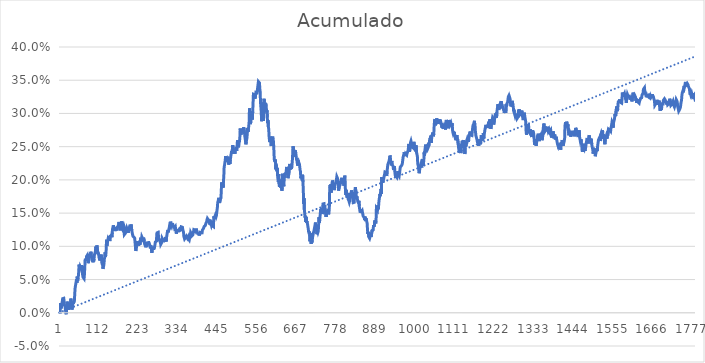
| Category | Acumulado |
|---|---|
| 0 | -0.001 |
| 1 | 0.015 |
| 2 | 0.009 |
| 3 | 0.006 |
| 4 | 0.012 |
| 5 | 0.011 |
| 6 | 0.017 |
| 7 | 0.021 |
| 8 | 0.021 |
| 9 | 0.022 |
| 10 | 0.022 |
| 11 | 0.017 |
| 12 | 0.011 |
| 13 | 0.011 |
| 14 | 0.009 |
| 15 | 0.003 |
| 16 | 0.002 |
| 17 | -0.002 |
| 18 | 0.007 |
| 19 | 0.012 |
| 20 | 0.017 |
| 21 | 0.008 |
| 22 | 0.005 |
| 23 | 0.008 |
| 24 | 0.005 |
| 25 | 0.005 |
| 26 | 0.011 |
| 27 | 0.011 |
| 28 | 0.011 |
| 29 | 0.013 |
| 30 | 0.021 |
| 31 | 0.014 |
| 32 | 0.015 |
| 33 | 0.005 |
| 34 | 0.005 |
| 35 | 0.011 |
| 36 | 0.017 |
| 37 | 0.014 |
| 38 | 0.014 |
| 39 | 0.013 |
| 40 | 0.019 |
| 41 | 0.03 |
| 42 | 0.038 |
| 43 | 0.041 |
| 44 | 0.042 |
| 45 | 0.047 |
| 46 | 0.051 |
| 47 | 0.045 |
| 48 | 0.054 |
| 49 | 0.049 |
| 50 | 0.053 |
| 51 | 0.055 |
| 52 | 0.062 |
| 53 | 0.072 |
| 54 | 0.073 |
| 55 | 0.067 |
| 56 | 0.07 |
| 57 | 0.07 |
| 58 | 0.067 |
| 59 | 0.069 |
| 60 | 0.072 |
| 61 | 0.065 |
| 62 | 0.06 |
| 63 | 0.059 |
| 64 | 0.054 |
| 65 | 0.055 |
| 66 | 0.052 |
| 67 | 0.051 |
| 68 | 0.057 |
| 69 | 0.068 |
| 70 | 0.079 |
| 71 | 0.081 |
| 72 | 0.081 |
| 73 | 0.08 |
| 74 | 0.085 |
| 75 | 0.086 |
| 76 | 0.087 |
| 77 | 0.085 |
| 78 | 0.08 |
| 79 | 0.075 |
| 80 | 0.074 |
| 81 | 0.082 |
| 82 | 0.086 |
| 83 | 0.089 |
| 84 | 0.089 |
| 85 | 0.083 |
| 86 | 0.092 |
| 87 | 0.088 |
| 88 | 0.087 |
| 89 | 0.082 |
| 90 | 0.08 |
| 91 | 0.079 |
| 92 | 0.076 |
| 93 | 0.079 |
| 94 | 0.077 |
| 95 | 0.081 |
| 96 | 0.087 |
| 97 | 0.087 |
| 98 | 0.087 |
| 99 | 0.093 |
| 100 | 0.1 |
| 101 | 0.091 |
| 102 | 0.095 |
| 103 | 0.101 |
| 104 | 0.101 |
| 105 | 0.1 |
| 106 | 0.088 |
| 107 | 0.09 |
| 108 | 0.088 |
| 109 | 0.083 |
| 110 | 0.082 |
| 111 | 0.079 |
| 112 | 0.081 |
| 113 | 0.082 |
| 114 | 0.08 |
| 115 | 0.088 |
| 116 | 0.082 |
| 117 | 0.075 |
| 118 | 0.074 |
| 119 | 0.072 |
| 120 | 0.066 |
| 121 | 0.068 |
| 122 | 0.07 |
| 123 | 0.075 |
| 124 | 0.081 |
| 125 | 0.084 |
| 126 | 0.091 |
| 127 | 0.084 |
| 128 | 0.088 |
| 129 | 0.095 |
| 130 | 0.11 |
| 131 | 0.101 |
| 132 | 0.103 |
| 133 | 0.102 |
| 134 | 0.11 |
| 135 | 0.113 |
| 136 | 0.112 |
| 137 | 0.114 |
| 138 | 0.111 |
| 139 | 0.108 |
| 140 | 0.11 |
| 141 | 0.116 |
| 142 | 0.115 |
| 143 | 0.117 |
| 144 | 0.117 |
| 145 | 0.114 |
| 146 | 0.121 |
| 147 | 0.126 |
| 148 | 0.128 |
| 149 | 0.132 |
| 150 | 0.129 |
| 151 | 0.126 |
| 152 | 0.129 |
| 153 | 0.126 |
| 154 | 0.123 |
| 155 | 0.122 |
| 156 | 0.129 |
| 157 | 0.131 |
| 158 | 0.13 |
| 159 | 0.124 |
| 160 | 0.128 |
| 161 | 0.128 |
| 162 | 0.13 |
| 163 | 0.131 |
| 164 | 0.133 |
| 165 | 0.137 |
| 166 | 0.129 |
| 167 | 0.128 |
| 168 | 0.126 |
| 169 | 0.124 |
| 170 | 0.127 |
| 171 | 0.133 |
| 172 | 0.138 |
| 173 | 0.132 |
| 174 | 0.131 |
| 175 | 0.127 |
| 176 | 0.128 |
| 177 | 0.129 |
| 178 | 0.132 |
| 179 | 0.13 |
| 180 | 0.118 |
| 181 | 0.117 |
| 182 | 0.118 |
| 183 | 0.12 |
| 184 | 0.118 |
| 185 | 0.122 |
| 186 | 0.125 |
| 187 | 0.127 |
| 188 | 0.127 |
| 189 | 0.127 |
| 190 | 0.123 |
| 191 | 0.12 |
| 192 | 0.125 |
| 193 | 0.126 |
| 194 | 0.127 |
| 195 | 0.131 |
| 196 | 0.13 |
| 197 | 0.132 |
| 198 | 0.13 |
| 199 | 0.133 |
| 200 | 0.134 |
| 201 | 0.123 |
| 202 | 0.123 |
| 203 | 0.123 |
| 204 | 0.115 |
| 205 | 0.116 |
| 206 | 0.114 |
| 207 | 0.114 |
| 208 | 0.115 |
| 209 | 0.112 |
| 210 | 0.111 |
| 211 | 0.1 |
| 212 | 0.093 |
| 213 | 0.095 |
| 214 | 0.098 |
| 215 | 0.101 |
| 216 | 0.108 |
| 217 | 0.104 |
| 218 | 0.107 |
| 219 | 0.105 |
| 220 | 0.101 |
| 221 | 0.103 |
| 222 | 0.106 |
| 223 | 0.105 |
| 224 | 0.102 |
| 225 | 0.11 |
| 226 | 0.113 |
| 227 | 0.107 |
| 228 | 0.11 |
| 229 | 0.114 |
| 230 | 0.114 |
| 231 | 0.112 |
| 232 | 0.113 |
| 233 | 0.11 |
| 234 | 0.113 |
| 235 | 0.113 |
| 236 | 0.107 |
| 237 | 0.105 |
| 238 | 0.102 |
| 239 | 0.1 |
| 240 | 0.099 |
| 241 | 0.101 |
| 242 | 0.1 |
| 243 | 0.101 |
| 244 | 0.101 |
| 245 | 0.107 |
| 246 | 0.105 |
| 247 | 0.106 |
| 248 | 0.104 |
| 249 | 0.106 |
| 250 | 0.106 |
| 251 | 0.105 |
| 252 | 0.101 |
| 253 | 0.097 |
| 254 | 0.101 |
| 255 | 0.101 |
| 256 | 0.096 |
| 257 | 0.09 |
| 258 | 0.093 |
| 259 | 0.094 |
| 260 | 0.097 |
| 261 | 0.099 |
| 262 | 0.095 |
| 263 | 0.095 |
| 264 | 0.094 |
| 265 | 0.1 |
| 266 | 0.101 |
| 267 | 0.107 |
| 268 | 0.107 |
| 269 | 0.107 |
| 270 | 0.108 |
| 271 | 0.119 |
| 272 | 0.12 |
| 273 | 0.12 |
| 274 | 0.121 |
| 275 | 0.121 |
| 276 | 0.113 |
| 277 | 0.108 |
| 278 | 0.111 |
| 279 | 0.111 |
| 280 | 0.11 |
| 281 | 0.106 |
| 282 | 0.103 |
| 283 | 0.102 |
| 284 | 0.103 |
| 285 | 0.106 |
| 286 | 0.112 |
| 287 | 0.111 |
| 288 | 0.11 |
| 289 | 0.106 |
| 290 | 0.108 |
| 291 | 0.107 |
| 292 | 0.109 |
| 293 | 0.109 |
| 294 | 0.108 |
| 295 | 0.112 |
| 296 | 0.114 |
| 297 | 0.107 |
| 298 | 0.112 |
| 299 | 0.113 |
| 300 | 0.113 |
| 301 | 0.123 |
| 302 | 0.122 |
| 303 | 0.122 |
| 304 | 0.123 |
| 305 | 0.126 |
| 306 | 0.128 |
| 307 | 0.131 |
| 308 | 0.131 |
| 309 | 0.13 |
| 310 | 0.137 |
| 311 | 0.133 |
| 312 | 0.134 |
| 313 | 0.131 |
| 314 | 0.132 |
| 315 | 0.135 |
| 316 | 0.132 |
| 317 | 0.133 |
| 318 | 0.131 |
| 319 | 0.13 |
| 320 | 0.131 |
| 321 | 0.128 |
| 322 | 0.127 |
| 323 | 0.13 |
| 324 | 0.126 |
| 325 | 0.121 |
| 326 | 0.119 |
| 327 | 0.119 |
| 328 | 0.124 |
| 329 | 0.123 |
| 330 | 0.123 |
| 331 | 0.124 |
| 332 | 0.124 |
| 333 | 0.125 |
| 334 | 0.126 |
| 335 | 0.125 |
| 336 | 0.124 |
| 337 | 0.124 |
| 338 | 0.122 |
| 339 | 0.125 |
| 340 | 0.129 |
| 341 | 0.129 |
| 342 | 0.129 |
| 343 | 0.129 |
| 344 | 0.125 |
| 345 | 0.126 |
| 346 | 0.121 |
| 347 | 0.115 |
| 348 | 0.115 |
| 349 | 0.111 |
| 350 | 0.112 |
| 351 | 0.112 |
| 352 | 0.114 |
| 353 | 0.115 |
| 354 | 0.115 |
| 355 | 0.116 |
| 356 | 0.114 |
| 357 | 0.112 |
| 358 | 0.113 |
| 359 | 0.114 |
| 360 | 0.111 |
| 361 | 0.112 |
| 362 | 0.109 |
| 363 | 0.112 |
| 364 | 0.114 |
| 365 | 0.116 |
| 366 | 0.121 |
| 367 | 0.122 |
| 368 | 0.119 |
| 369 | 0.115 |
| 370 | 0.114 |
| 371 | 0.116 |
| 372 | 0.117 |
| 373 | 0.12 |
| 374 | 0.122 |
| 375 | 0.125 |
| 376 | 0.124 |
| 377 | 0.125 |
| 378 | 0.125 |
| 379 | 0.124 |
| 380 | 0.123 |
| 381 | 0.124 |
| 382 | 0.127 |
| 383 | 0.123 |
| 384 | 0.124 |
| 385 | 0.123 |
| 386 | 0.119 |
| 387 | 0.118 |
| 388 | 0.119 |
| 389 | 0.118 |
| 390 | 0.116 |
| 391 | 0.119 |
| 392 | 0.118 |
| 393 | 0.119 |
| 394 | 0.123 |
| 395 | 0.12 |
| 396 | 0.12 |
| 397 | 0.12 |
| 398 | 0.12 |
| 399 | 0.124 |
| 400 | 0.124 |
| 401 | 0.124 |
| 402 | 0.127 |
| 403 | 0.128 |
| 404 | 0.13 |
| 405 | 0.129 |
| 406 | 0.129 |
| 407 | 0.131 |
| 408 | 0.132 |
| 409 | 0.135 |
| 410 | 0.135 |
| 411 | 0.137 |
| 412 | 0.14 |
| 413 | 0.142 |
| 414 | 0.141 |
| 415 | 0.14 |
| 416 | 0.14 |
| 417 | 0.138 |
| 418 | 0.141 |
| 419 | 0.137 |
| 420 | 0.133 |
| 421 | 0.134 |
| 422 | 0.137 |
| 423 | 0.134 |
| 424 | 0.132 |
| 425 | 0.134 |
| 426 | 0.135 |
| 427 | 0.131 |
| 428 | 0.131 |
| 429 | 0.131 |
| 430 | 0.13 |
| 431 | 0.145 |
| 432 | 0.146 |
| 433 | 0.142 |
| 434 | 0.145 |
| 435 | 0.146 |
| 436 | 0.147 |
| 437 | 0.144 |
| 438 | 0.146 |
| 439 | 0.147 |
| 440 | 0.154 |
| 441 | 0.159 |
| 442 | 0.166 |
| 443 | 0.168 |
| 444 | 0.168 |
| 445 | 0.173 |
| 446 | 0.171 |
| 447 | 0.165 |
| 448 | 0.166 |
| 449 | 0.17 |
| 450 | 0.169 |
| 451 | 0.173 |
| 452 | 0.185 |
| 453 | 0.196 |
| 454 | 0.195 |
| 455 | 0.19 |
| 456 | 0.193 |
| 457 | 0.188 |
| 458 | 0.198 |
| 459 | 0.206 |
| 460 | 0.22 |
| 461 | 0.222 |
| 462 | 0.226 |
| 463 | 0.229 |
| 464 | 0.236 |
| 465 | 0.23 |
| 466 | 0.23 |
| 467 | 0.232 |
| 468 | 0.23 |
| 469 | 0.227 |
| 470 | 0.235 |
| 471 | 0.233 |
| 472 | 0.226 |
| 473 | 0.223 |
| 474 | 0.228 |
| 475 | 0.233 |
| 476 | 0.224 |
| 477 | 0.23 |
| 478 | 0.233 |
| 479 | 0.237 |
| 480 | 0.24 |
| 481 | 0.243 |
| 482 | 0.239 |
| 483 | 0.245 |
| 484 | 0.252 |
| 485 | 0.251 |
| 486 | 0.252 |
| 487 | 0.24 |
| 488 | 0.244 |
| 489 | 0.242 |
| 490 | 0.239 |
| 491 | 0.242 |
| 492 | 0.241 |
| 493 | 0.243 |
| 494 | 0.249 |
| 495 | 0.244 |
| 496 | 0.249 |
| 497 | 0.257 |
| 498 | 0.26 |
| 499 | 0.255 |
| 500 | 0.249 |
| 501 | 0.252 |
| 502 | 0.256 |
| 503 | 0.258 |
| 504 | 0.264 |
| 505 | 0.277 |
| 506 | 0.273 |
| 507 | 0.268 |
| 508 | 0.268 |
| 509 | 0.273 |
| 510 | 0.275 |
| 511 | 0.272 |
| 512 | 0.276 |
| 513 | 0.274 |
| 514 | 0.274 |
| 515 | 0.279 |
| 516 | 0.279 |
| 517 | 0.271 |
| 518 | 0.265 |
| 519 | 0.262 |
| 520 | 0.258 |
| 521 | 0.254 |
| 522 | 0.258 |
| 523 | 0.258 |
| 524 | 0.263 |
| 525 | 0.265 |
| 526 | 0.278 |
| 527 | 0.272 |
| 528 | 0.276 |
| 529 | 0.281 |
| 530 | 0.287 |
| 531 | 0.308 |
| 532 | 0.293 |
| 533 | 0.297 |
| 534 | 0.284 |
| 535 | 0.292 |
| 536 | 0.295 |
| 537 | 0.298 |
| 538 | 0.303 |
| 539 | 0.291 |
| 540 | 0.303 |
| 541 | 0.315 |
| 542 | 0.329 |
| 543 | 0.33 |
| 544 | 0.33 |
| 545 | 0.328 |
| 546 | 0.322 |
| 547 | 0.324 |
| 548 | 0.327 |
| 549 | 0.332 |
| 550 | 0.333 |
| 551 | 0.33 |
| 552 | 0.331 |
| 553 | 0.335 |
| 554 | 0.335 |
| 555 | 0.334 |
| 556 | 0.348 |
| 557 | 0.348 |
| 558 | 0.347 |
| 559 | 0.346 |
| 560 | 0.337 |
| 561 | 0.333 |
| 562 | 0.316 |
| 563 | 0.317 |
| 564 | 0.302 |
| 565 | 0.288 |
| 566 | 0.297 |
| 567 | 0.31 |
| 568 | 0.317 |
| 569 | 0.314 |
| 570 | 0.289 |
| 571 | 0.307 |
| 572 | 0.322 |
| 573 | 0.31 |
| 574 | 0.312 |
| 575 | 0.308 |
| 576 | 0.316 |
| 577 | 0.316 |
| 578 | 0.311 |
| 579 | 0.302 |
| 580 | 0.305 |
| 581 | 0.294 |
| 582 | 0.285 |
| 583 | 0.29 |
| 584 | 0.28 |
| 585 | 0.277 |
| 586 | 0.265 |
| 587 | 0.26 |
| 588 | 0.257 |
| 589 | 0.265 |
| 590 | 0.262 |
| 591 | 0.255 |
| 592 | 0.251 |
| 593 | 0.257 |
| 594 | 0.257 |
| 595 | 0.256 |
| 596 | 0.265 |
| 597 | 0.261 |
| 598 | 0.259 |
| 599 | 0.251 |
| 600 | 0.237 |
| 601 | 0.229 |
| 602 | 0.231 |
| 603 | 0.227 |
| 604 | 0.23 |
| 605 | 0.216 |
| 606 | 0.223 |
| 607 | 0.217 |
| 608 | 0.213 |
| 609 | 0.218 |
| 610 | 0.206 |
| 611 | 0.201 |
| 612 | 0.197 |
| 613 | 0.209 |
| 614 | 0.194 |
| 615 | 0.189 |
| 616 | 0.191 |
| 617 | 0.2 |
| 618 | 0.198 |
| 619 | 0.188 |
| 620 | 0.191 |
| 621 | 0.187 |
| 622 | 0.184 |
| 623 | 0.189 |
| 624 | 0.209 |
| 625 | 0.198 |
| 626 | 0.202 |
| 627 | 0.19 |
| 628 | 0.206 |
| 629 | 0.207 |
| 630 | 0.203 |
| 631 | 0.209 |
| 632 | 0.21 |
| 633 | 0.208 |
| 634 | 0.212 |
| 635 | 0.22 |
| 636 | 0.217 |
| 637 | 0.218 |
| 638 | 0.218 |
| 639 | 0.203 |
| 640 | 0.206 |
| 641 | 0.206 |
| 642 | 0.209 |
| 643 | 0.216 |
| 644 | 0.224 |
| 645 | 0.216 |
| 646 | 0.219 |
| 647 | 0.216 |
| 648 | 0.221 |
| 649 | 0.217 |
| 650 | 0.223 |
| 651 | 0.226 |
| 652 | 0.237 |
| 653 | 0.251 |
| 654 | 0.251 |
| 655 | 0.246 |
| 656 | 0.239 |
| 657 | 0.235 |
| 658 | 0.234 |
| 659 | 0.245 |
| 660 | 0.245 |
| 661 | 0.24 |
| 662 | 0.24 |
| 663 | 0.231 |
| 664 | 0.233 |
| 665 | 0.226 |
| 666 | 0.221 |
| 667 | 0.226 |
| 668 | 0.229 |
| 669 | 0.223 |
| 670 | 0.225 |
| 671 | 0.223 |
| 672 | 0.22 |
| 673 | 0.215 |
| 674 | 0.213 |
| 675 | 0.202 |
| 676 | 0.203 |
| 677 | 0.207 |
| 678 | 0.204 |
| 679 | 0.199 |
| 680 | 0.208 |
| 681 | 0.197 |
| 682 | 0.184 |
| 683 | 0.164 |
| 684 | 0.172 |
| 685 | 0.155 |
| 686 | 0.149 |
| 687 | 0.143 |
| 688 | 0.146 |
| 689 | 0.137 |
| 690 | 0.144 |
| 691 | 0.135 |
| 692 | 0.138 |
| 693 | 0.136 |
| 694 | 0.133 |
| 695 | 0.133 |
| 696 | 0.126 |
| 697 | 0.121 |
| 698 | 0.123 |
| 699 | 0.119 |
| 700 | 0.12 |
| 701 | 0.108 |
| 702 | 0.12 |
| 703 | 0.11 |
| 704 | 0.104 |
| 705 | 0.11 |
| 706 | 0.106 |
| 707 | 0.109 |
| 708 | 0.114 |
| 709 | 0.113 |
| 710 | 0.12 |
| 711 | 0.121 |
| 712 | 0.12 |
| 713 | 0.122 |
| 714 | 0.129 |
| 715 | 0.132 |
| 716 | 0.136 |
| 717 | 0.129 |
| 718 | 0.128 |
| 719 | 0.127 |
| 720 | 0.118 |
| 721 | 0.126 |
| 722 | 0.123 |
| 723 | 0.121 |
| 724 | 0.123 |
| 725 | 0.124 |
| 726 | 0.144 |
| 727 | 0.136 |
| 728 | 0.139 |
| 729 | 0.14 |
| 730 | 0.152 |
| 731 | 0.156 |
| 732 | 0.154 |
| 733 | 0.153 |
| 734 | 0.158 |
| 735 | 0.149 |
| 736 | 0.15 |
| 737 | 0.164 |
| 738 | 0.165 |
| 739 | 0.163 |
| 740 | 0.164 |
| 741 | 0.158 |
| 742 | 0.162 |
| 743 | 0.154 |
| 744 | 0.15 |
| 745 | 0.151 |
| 746 | 0.144 |
| 747 | 0.152 |
| 748 | 0.152 |
| 749 | 0.152 |
| 750 | 0.154 |
| 751 | 0.152 |
| 752 | 0.151 |
| 753 | 0.148 |
| 754 | 0.155 |
| 755 | 0.156 |
| 756 | 0.187 |
| 757 | 0.192 |
| 758 | 0.188 |
| 759 | 0.193 |
| 760 | 0.181 |
| 761 | 0.188 |
| 762 | 0.193 |
| 763 | 0.193 |
| 764 | 0.199 |
| 765 | 0.198 |
| 766 | 0.19 |
| 767 | 0.193 |
| 768 | 0.188 |
| 769 | 0.185 |
| 770 | 0.189 |
| 771 | 0.193 |
| 772 | 0.193 |
| 773 | 0.193 |
| 774 | 0.197 |
| 775 | 0.198 |
| 776 | 0.205 |
| 777 | 0.205 |
| 778 | 0.202 |
| 779 | 0.195 |
| 780 | 0.198 |
| 781 | 0.184 |
| 782 | 0.184 |
| 783 | 0.19 |
| 784 | 0.19 |
| 785 | 0.192 |
| 786 | 0.193 |
| 787 | 0.198 |
| 788 | 0.2 |
| 789 | 0.201 |
| 790 | 0.203 |
| 791 | 0.202 |
| 792 | 0.195 |
| 793 | 0.2 |
| 794 | 0.198 |
| 795 | 0.195 |
| 796 | 0.191 |
| 797 | 0.201 |
| 798 | 0.206 |
| 799 | 0.204 |
| 800 | 0.187 |
| 801 | 0.177 |
| 802 | 0.182 |
| 803 | 0.185 |
| 804 | 0.176 |
| 805 | 0.176 |
| 806 | 0.174 |
| 807 | 0.18 |
| 808 | 0.171 |
| 809 | 0.17 |
| 810 | 0.168 |
| 811 | 0.166 |
| 812 | 0.168 |
| 813 | 0.177 |
| 814 | 0.176 |
| 815 | 0.176 |
| 816 | 0.176 |
| 817 | 0.184 |
| 818 | 0.179 |
| 819 | 0.178 |
| 820 | 0.178 |
| 821 | 0.17 |
| 822 | 0.166 |
| 823 | 0.165 |
| 824 | 0.165 |
| 825 | 0.166 |
| 826 | 0.182 |
| 827 | 0.185 |
| 828 | 0.189 |
| 829 | 0.19 |
| 830 | 0.179 |
| 831 | 0.171 |
| 832 | 0.175 |
| 833 | 0.173 |
| 834 | 0.17 |
| 835 | 0.167 |
| 836 | 0.167 |
| 837 | 0.166 |
| 838 | 0.169 |
| 839 | 0.16 |
| 840 | 0.156 |
| 841 | 0.152 |
| 842 | 0.151 |
| 843 | 0.151 |
| 844 | 0.152 |
| 845 | 0.151 |
| 846 | 0.152 |
| 847 | 0.154 |
| 848 | 0.153 |
| 849 | 0.155 |
| 850 | 0.145 |
| 851 | 0.145 |
| 852 | 0.146 |
| 853 | 0.143 |
| 854 | 0.139 |
| 855 | 0.145 |
| 856 | 0.144 |
| 857 | 0.138 |
| 858 | 0.142 |
| 859 | 0.14 |
| 860 | 0.137 |
| 861 | 0.135 |
| 862 | 0.126 |
| 863 | 0.119 |
| 864 | 0.122 |
| 865 | 0.121 |
| 866 | 0.114 |
| 867 | 0.114 |
| 868 | 0.112 |
| 869 | 0.111 |
| 870 | 0.116 |
| 871 | 0.12 |
| 872 | 0.114 |
| 873 | 0.115 |
| 874 | 0.116 |
| 875 | 0.124 |
| 876 | 0.123 |
| 877 | 0.125 |
| 878 | 0.125 |
| 879 | 0.132 |
| 880 | 0.133 |
| 881 | 0.13 |
| 882 | 0.137 |
| 883 | 0.139 |
| 884 | 0.14 |
| 885 | 0.135 |
| 886 | 0.138 |
| 887 | 0.157 |
| 888 | 0.158 |
| 889 | 0.158 |
| 890 | 0.155 |
| 891 | 0.162 |
| 892 | 0.156 |
| 893 | 0.159 |
| 894 | 0.167 |
| 895 | 0.171 |
| 896 | 0.175 |
| 897 | 0.179 |
| 898 | 0.176 |
| 899 | 0.182 |
| 900 | 0.186 |
| 901 | 0.179 |
| 902 | 0.204 |
| 903 | 0.198 |
| 904 | 0.202 |
| 905 | 0.196 |
| 906 | 0.198 |
| 907 | 0.201 |
| 908 | 0.199 |
| 909 | 0.206 |
| 910 | 0.208 |
| 911 | 0.212 |
| 912 | 0.211 |
| 913 | 0.211 |
| 914 | 0.211 |
| 915 | 0.208 |
| 916 | 0.206 |
| 917 | 0.214 |
| 918 | 0.218 |
| 919 | 0.223 |
| 920 | 0.222 |
| 921 | 0.223 |
| 922 | 0.228 |
| 923 | 0.229 |
| 924 | 0.23 |
| 925 | 0.237 |
| 926 | 0.235 |
| 927 | 0.226 |
| 928 | 0.227 |
| 929 | 0.222 |
| 930 | 0.228 |
| 931 | 0.226 |
| 932 | 0.223 |
| 933 | 0.223 |
| 934 | 0.22 |
| 935 | 0.215 |
| 936 | 0.218 |
| 937 | 0.22 |
| 938 | 0.219 |
| 939 | 0.21 |
| 940 | 0.209 |
| 941 | 0.203 |
| 942 | 0.206 |
| 943 | 0.206 |
| 944 | 0.207 |
| 945 | 0.204 |
| 946 | 0.205 |
| 947 | 0.213 |
| 948 | 0.213 |
| 949 | 0.209 |
| 950 | 0.21 |
| 951 | 0.206 |
| 952 | 0.21 |
| 953 | 0.21 |
| 954 | 0.219 |
| 955 | 0.221 |
| 956 | 0.219 |
| 957 | 0.221 |
| 958 | 0.222 |
| 959 | 0.223 |
| 960 | 0.226 |
| 961 | 0.226 |
| 962 | 0.234 |
| 963 | 0.236 |
| 964 | 0.238 |
| 965 | 0.242 |
| 966 | 0.24 |
| 967 | 0.238 |
| 968 | 0.236 |
| 969 | 0.239 |
| 970 | 0.239 |
| 971 | 0.239 |
| 972 | 0.237 |
| 973 | 0.24 |
| 974 | 0.239 |
| 975 | 0.239 |
| 976 | 0.244 |
| 977 | 0.249 |
| 978 | 0.254 |
| 979 | 0.247 |
| 980 | 0.242 |
| 981 | 0.247 |
| 982 | 0.254 |
| 983 | 0.257 |
| 984 | 0.258 |
| 985 | 0.258 |
| 986 | 0.254 |
| 987 | 0.249 |
| 988 | 0.249 |
| 989 | 0.25 |
| 990 | 0.248 |
| 991 | 0.249 |
| 992 | 0.257 |
| 993 | 0.257 |
| 994 | 0.251 |
| 995 | 0.247 |
| 996 | 0.246 |
| 997 | 0.243 |
| 998 | 0.252 |
| 999 | 0.251 |
| 1000 | 0.24 |
| 1001 | 0.238 |
| 1002 | 0.235 |
| 1003 | 0.224 |
| 1004 | 0.223 |
| 1005 | 0.22 |
| 1006 | 0.214 |
| 1007 | 0.21 |
| 1008 | 0.214 |
| 1009 | 0.214 |
| 1010 | 0.221 |
| 1011 | 0.221 |
| 1012 | 0.224 |
| 1013 | 0.222 |
| 1014 | 0.219 |
| 1015 | 0.224 |
| 1016 | 0.231 |
| 1017 | 0.231 |
| 1018 | 0.222 |
| 1019 | 0.226 |
| 1020 | 0.229 |
| 1021 | 0.242 |
| 1022 | 0.237 |
| 1023 | 0.244 |
| 1024 | 0.245 |
| 1025 | 0.253 |
| 1026 | 0.242 |
| 1027 | 0.245 |
| 1028 | 0.249 |
| 1029 | 0.248 |
| 1030 | 0.251 |
| 1031 | 0.25 |
| 1032 | 0.249 |
| 1033 | 0.249 |
| 1034 | 0.248 |
| 1035 | 0.252 |
| 1036 | 0.26 |
| 1037 | 0.258 |
| 1038 | 0.263 |
| 1039 | 0.259 |
| 1040 | 0.267 |
| 1041 | 0.256 |
| 1042 | 0.263 |
| 1043 | 0.267 |
| 1044 | 0.269 |
| 1045 | 0.271 |
| 1046 | 0.268 |
| 1047 | 0.266 |
| 1048 | 0.27 |
| 1049 | 0.281 |
| 1050 | 0.288 |
| 1051 | 0.292 |
| 1052 | 0.288 |
| 1053 | 0.282 |
| 1054 | 0.285 |
| 1055 | 0.287 |
| 1056 | 0.293 |
| 1057 | 0.294 |
| 1058 | 0.294 |
| 1059 | 0.284 |
| 1060 | 0.287 |
| 1061 | 0.286 |
| 1062 | 0.288 |
| 1063 | 0.291 |
| 1064 | 0.285 |
| 1065 | 0.287 |
| 1066 | 0.291 |
| 1067 | 0.289 |
| 1068 | 0.285 |
| 1069 | 0.283 |
| 1070 | 0.285 |
| 1071 | 0.279 |
| 1072 | 0.284 |
| 1073 | 0.284 |
| 1074 | 0.277 |
| 1075 | 0.279 |
| 1076 | 0.277 |
| 1077 | 0.279 |
| 1078 | 0.281 |
| 1079 | 0.282 |
| 1080 | 0.28 |
| 1081 | 0.276 |
| 1082 | 0.287 |
| 1083 | 0.29 |
| 1084 | 0.289 |
| 1085 | 0.286 |
| 1086 | 0.29 |
| 1087 | 0.281 |
| 1088 | 0.283 |
| 1089 | 0.278 |
| 1090 | 0.29 |
| 1091 | 0.287 |
| 1092 | 0.29 |
| 1093 | 0.29 |
| 1094 | 0.283 |
| 1095 | 0.284 |
| 1096 | 0.286 |
| 1097 | 0.287 |
| 1098 | 0.281 |
| 1099 | 0.285 |
| 1100 | 0.281 |
| 1101 | 0.273 |
| 1102 | 0.271 |
| 1103 | 0.272 |
| 1104 | 0.272 |
| 1105 | 0.273 |
| 1106 | 0.271 |
| 1107 | 0.266 |
| 1108 | 0.266 |
| 1109 | 0.266 |
| 1110 | 0.26 |
| 1111 | 0.265 |
| 1112 | 0.264 |
| 1113 | 0.267 |
| 1114 | 0.259 |
| 1115 | 0.261 |
| 1116 | 0.262 |
| 1117 | 0.261 |
| 1118 | 0.248 |
| 1119 | 0.242 |
| 1120 | 0.244 |
| 1121 | 0.241 |
| 1122 | 0.243 |
| 1123 | 0.243 |
| 1124 | 0.24 |
| 1125 | 0.244 |
| 1126 | 0.253 |
| 1127 | 0.252 |
| 1128 | 0.259 |
| 1129 | 0.254 |
| 1130 | 0.254 |
| 1131 | 0.253 |
| 1132 | 0.26 |
| 1133 | 0.256 |
| 1134 | 0.246 |
| 1135 | 0.239 |
| 1136 | 0.244 |
| 1137 | 0.253 |
| 1138 | 0.25 |
| 1139 | 0.255 |
| 1140 | 0.259 |
| 1141 | 0.259 |
| 1142 | 0.262 |
| 1143 | 0.26 |
| 1144 | 0.262 |
| 1145 | 0.257 |
| 1146 | 0.26 |
| 1147 | 0.266 |
| 1148 | 0.269 |
| 1149 | 0.271 |
| 1150 | 0.273 |
| 1151 | 0.269 |
| 1152 | 0.267 |
| 1153 | 0.268 |
| 1154 | 0.267 |
| 1155 | 0.267 |
| 1156 | 0.273 |
| 1157 | 0.278 |
| 1158 | 0.282 |
| 1159 | 0.281 |
| 1160 | 0.284 |
| 1161 | 0.285 |
| 1162 | 0.289 |
| 1163 | 0.29 |
| 1164 | 0.276 |
| 1165 | 0.272 |
| 1166 | 0.267 |
| 1167 | 0.268 |
| 1168 | 0.263 |
| 1169 | 0.261 |
| 1170 | 0.262 |
| 1171 | 0.255 |
| 1172 | 0.257 |
| 1173 | 0.257 |
| 1174 | 0.251 |
| 1175 | 0.256 |
| 1176 | 0.255 |
| 1177 | 0.261 |
| 1178 | 0.26 |
| 1179 | 0.254 |
| 1180 | 0.257 |
| 1181 | 0.267 |
| 1182 | 0.264 |
| 1183 | 0.266 |
| 1184 | 0.267 |
| 1185 | 0.259 |
| 1186 | 0.264 |
| 1187 | 0.27 |
| 1188 | 0.262 |
| 1189 | 0.266 |
| 1190 | 0.27 |
| 1191 | 0.269 |
| 1192 | 0.277 |
| 1193 | 0.279 |
| 1194 | 0.283 |
| 1195 | 0.284 |
| 1196 | 0.282 |
| 1197 | 0.278 |
| 1198 | 0.282 |
| 1199 | 0.278 |
| 1200 | 0.281 |
| 1201 | 0.284 |
| 1202 | 0.288 |
| 1203 | 0.283 |
| 1204 | 0.287 |
| 1205 | 0.291 |
| 1206 | 0.292 |
| 1207 | 0.281 |
| 1208 | 0.277 |
| 1209 | 0.277 |
| 1210 | 0.285 |
| 1211 | 0.287 |
| 1212 | 0.291 |
| 1213 | 0.294 |
| 1214 | 0.293 |
| 1215 | 0.292 |
| 1216 | 0.283 |
| 1217 | 0.282 |
| 1218 | 0.289 |
| 1219 | 0.29 |
| 1220 | 0.297 |
| 1221 | 0.3 |
| 1222 | 0.298 |
| 1223 | 0.297 |
| 1224 | 0.294 |
| 1225 | 0.302 |
| 1226 | 0.306 |
| 1227 | 0.306 |
| 1228 | 0.314 |
| 1229 | 0.309 |
| 1230 | 0.305 |
| 1231 | 0.309 |
| 1232 | 0.306 |
| 1233 | 0.313 |
| 1234 | 0.314 |
| 1235 | 0.313 |
| 1236 | 0.317 |
| 1237 | 0.318 |
| 1238 | 0.318 |
| 1239 | 0.312 |
| 1240 | 0.308 |
| 1241 | 0.31 |
| 1242 | 0.309 |
| 1243 | 0.307 |
| 1244 | 0.305 |
| 1245 | 0.306 |
| 1246 | 0.301 |
| 1247 | 0.307 |
| 1248 | 0.304 |
| 1249 | 0.305 |
| 1250 | 0.301 |
| 1251 | 0.314 |
| 1252 | 0.311 |
| 1253 | 0.314 |
| 1254 | 0.315 |
| 1255 | 0.317 |
| 1256 | 0.32 |
| 1257 | 0.325 |
| 1258 | 0.325 |
| 1259 | 0.327 |
| 1260 | 0.328 |
| 1261 | 0.324 |
| 1262 | 0.322 |
| 1263 | 0.322 |
| 1264 | 0.31 |
| 1265 | 0.311 |
| 1266 | 0.313 |
| 1267 | 0.314 |
| 1268 | 0.319 |
| 1269 | 0.319 |
| 1270 | 0.312 |
| 1271 | 0.31 |
| 1272 | 0.303 |
| 1273 | 0.306 |
| 1274 | 0.301 |
| 1275 | 0.301 |
| 1276 | 0.297 |
| 1277 | 0.297 |
| 1278 | 0.3 |
| 1279 | 0.296 |
| 1280 | 0.294 |
| 1281 | 0.292 |
| 1282 | 0.292 |
| 1283 | 0.292 |
| 1284 | 0.294 |
| 1285 | 0.302 |
| 1286 | 0.306 |
| 1287 | 0.303 |
| 1288 | 0.306 |
| 1289 | 0.301 |
| 1290 | 0.298 |
| 1291 | 0.298 |
| 1292 | 0.299 |
| 1293 | 0.3 |
| 1294 | 0.302 |
| 1295 | 0.304 |
| 1296 | 0.3 |
| 1297 | 0.295 |
| 1298 | 0.295 |
| 1299 | 0.29 |
| 1300 | 0.294 |
| 1301 | 0.298 |
| 1302 | 0.301 |
| 1303 | 0.296 |
| 1304 | 0.293 |
| 1305 | 0.294 |
| 1306 | 0.287 |
| 1307 | 0.273 |
| 1308 | 0.268 |
| 1309 | 0.268 |
| 1310 | 0.274 |
| 1311 | 0.279 |
| 1312 | 0.281 |
| 1313 | 0.284 |
| 1314 | 0.281 |
| 1315 | 0.272 |
| 1316 | 0.274 |
| 1317 | 0.271 |
| 1318 | 0.274 |
| 1319 | 0.276 |
| 1320 | 0.275 |
| 1321 | 0.268 |
| 1322 | 0.272 |
| 1323 | 0.264 |
| 1324 | 0.265 |
| 1325 | 0.274 |
| 1326 | 0.273 |
| 1327 | 0.274 |
| 1328 | 0.27 |
| 1329 | 0.265 |
| 1330 | 0.257 |
| 1331 | 0.253 |
| 1332 | 0.261 |
| 1333 | 0.261 |
| 1334 | 0.256 |
| 1335 | 0.251 |
| 1336 | 0.255 |
| 1337 | 0.258 |
| 1338 | 0.26 |
| 1339 | 0.267 |
| 1340 | 0.263 |
| 1341 | 0.269 |
| 1342 | 0.265 |
| 1343 | 0.264 |
| 1344 | 0.258 |
| 1345 | 0.258 |
| 1346 | 0.266 |
| 1347 | 0.265 |
| 1348 | 0.268 |
| 1349 | 0.263 |
| 1350 | 0.265 |
| 1351 | 0.26 |
| 1352 | 0.259 |
| 1353 | 0.262 |
| 1354 | 0.27 |
| 1355 | 0.278 |
| 1356 | 0.281 |
| 1357 | 0.285 |
| 1358 | 0.277 |
| 1359 | 0.281 |
| 1360 | 0.273 |
| 1361 | 0.272 |
| 1362 | 0.274 |
| 1363 | 0.276 |
| 1364 | 0.273 |
| 1365 | 0.274 |
| 1366 | 0.277 |
| 1367 | 0.28 |
| 1368 | 0.277 |
| 1369 | 0.274 |
| 1370 | 0.273 |
| 1371 | 0.276 |
| 1372 | 0.276 |
| 1373 | 0.272 |
| 1374 | 0.273 |
| 1375 | 0.272 |
| 1376 | 0.275 |
| 1377 | 0.27 |
| 1378 | 0.264 |
| 1379 | 0.266 |
| 1380 | 0.271 |
| 1381 | 0.267 |
| 1382 | 0.269 |
| 1383 | 0.273 |
| 1384 | 0.266 |
| 1385 | 0.262 |
| 1386 | 0.266 |
| 1387 | 0.268 |
| 1388 | 0.266 |
| 1389 | 0.261 |
| 1390 | 0.26 |
| 1391 | 0.265 |
| 1392 | 0.263 |
| 1393 | 0.264 |
| 1394 | 0.257 |
| 1395 | 0.254 |
| 1396 | 0.253 |
| 1397 | 0.251 |
| 1398 | 0.253 |
| 1399 | 0.254 |
| 1400 | 0.247 |
| 1401 | 0.249 |
| 1402 | 0.255 |
| 1403 | 0.253 |
| 1404 | 0.245 |
| 1405 | 0.256 |
| 1406 | 0.254 |
| 1407 | 0.257 |
| 1408 | 0.26 |
| 1409 | 0.258 |
| 1410 | 0.254 |
| 1411 | 0.251 |
| 1412 | 0.254 |
| 1413 | 0.255 |
| 1414 | 0.259 |
| 1415 | 0.263 |
| 1416 | 0.282 |
| 1417 | 0.285 |
| 1418 | 0.283 |
| 1419 | 0.286 |
| 1420 | 0.285 |
| 1421 | 0.288 |
| 1422 | 0.283 |
| 1423 | 0.279 |
| 1424 | 0.284 |
| 1425 | 0.276 |
| 1426 | 0.277 |
| 1427 | 0.267 |
| 1428 | 0.271 |
| 1429 | 0.272 |
| 1430 | 0.273 |
| 1431 | 0.27 |
| 1432 | 0.265 |
| 1433 | 0.264 |
| 1434 | 0.265 |
| 1435 | 0.271 |
| 1436 | 0.271 |
| 1437 | 0.272 |
| 1438 | 0.27 |
| 1439 | 0.274 |
| 1440 | 0.272 |
| 1441 | 0.272 |
| 1442 | 0.266 |
| 1443 | 0.268 |
| 1444 | 0.267 |
| 1445 | 0.271 |
| 1446 | 0.278 |
| 1447 | 0.28 |
| 1448 | 0.275 |
| 1449 | 0.276 |
| 1450 | 0.274 |
| 1451 | 0.267 |
| 1452 | 0.266 |
| 1453 | 0.265 |
| 1454 | 0.269 |
| 1455 | 0.267 |
| 1456 | 0.275 |
| 1457 | 0.264 |
| 1458 | 0.264 |
| 1459 | 0.259 |
| 1460 | 0.259 |
| 1461 | 0.262 |
| 1462 | 0.256 |
| 1463 | 0.252 |
| 1464 | 0.245 |
| 1465 | 0.242 |
| 1466 | 0.247 |
| 1467 | 0.254 |
| 1468 | 0.25 |
| 1469 | 0.248 |
| 1470 | 0.247 |
| 1471 | 0.25 |
| 1472 | 0.244 |
| 1473 | 0.246 |
| 1474 | 0.249 |
| 1475 | 0.253 |
| 1476 | 0.254 |
| 1477 | 0.26 |
| 1478 | 0.263 |
| 1479 | 0.262 |
| 1480 | 0.26 |
| 1481 | 0.255 |
| 1482 | 0.26 |
| 1483 | 0.266 |
| 1484 | 0.267 |
| 1485 | 0.268 |
| 1486 | 0.259 |
| 1487 | 0.261 |
| 1488 | 0.261 |
| 1489 | 0.26 |
| 1490 | 0.262 |
| 1491 | 0.254 |
| 1492 | 0.25 |
| 1493 | 0.248 |
| 1494 | 0.246 |
| 1495 | 0.239 |
| 1496 | 0.243 |
| 1497 | 0.242 |
| 1498 | 0.245 |
| 1499 | 0.245 |
| 1500 | 0.242 |
| 1501 | 0.236 |
| 1502 | 0.239 |
| 1503 | 0.241 |
| 1504 | 0.241 |
| 1505 | 0.247 |
| 1506 | 0.243 |
| 1507 | 0.249 |
| 1508 | 0.253 |
| 1509 | 0.253 |
| 1510 | 0.26 |
| 1511 | 0.259 |
| 1512 | 0.261 |
| 1513 | 0.264 |
| 1514 | 0.261 |
| 1515 | 0.258 |
| 1516 | 0.267 |
| 1517 | 0.269 |
| 1518 | 0.271 |
| 1519 | 0.269 |
| 1520 | 0.269 |
| 1521 | 0.274 |
| 1522 | 0.272 |
| 1523 | 0.262 |
| 1524 | 0.268 |
| 1525 | 0.266 |
| 1526 | 0.265 |
| 1527 | 0.257 |
| 1528 | 0.254 |
| 1529 | 0.261 |
| 1530 | 0.262 |
| 1531 | 0.261 |
| 1532 | 0.266 |
| 1533 | 0.266 |
| 1534 | 0.262 |
| 1535 | 0.269 |
| 1536 | 0.267 |
| 1537 | 0.273 |
| 1538 | 0.277 |
| 1539 | 0.278 |
| 1540 | 0.278 |
| 1541 | 0.275 |
| 1542 | 0.275 |
| 1543 | 0.277 |
| 1544 | 0.273 |
| 1545 | 0.278 |
| 1546 | 0.279 |
| 1547 | 0.283 |
| 1548 | 0.287 |
| 1549 | 0.286 |
| 1550 | 0.285 |
| 1551 | 0.279 |
| 1552 | 0.285 |
| 1553 | 0.288 |
| 1554 | 0.288 |
| 1555 | 0.292 |
| 1556 | 0.299 |
| 1557 | 0.298 |
| 1558 | 0.296 |
| 1559 | 0.296 |
| 1560 | 0.306 |
| 1561 | 0.311 |
| 1562 | 0.311 |
| 1563 | 0.304 |
| 1564 | 0.306 |
| 1565 | 0.315 |
| 1566 | 0.319 |
| 1567 | 0.316 |
| 1568 | 0.316 |
| 1569 | 0.321 |
| 1570 | 0.319 |
| 1571 | 0.319 |
| 1572 | 0.317 |
| 1573 | 0.317 |
| 1574 | 0.317 |
| 1575 | 0.316 |
| 1576 | 0.322 |
| 1577 | 0.331 |
| 1578 | 0.329 |
| 1579 | 0.329 |
| 1580 | 0.325 |
| 1581 | 0.328 |
| 1582 | 0.328 |
| 1583 | 0.33 |
| 1584 | 0.327 |
| 1585 | 0.323 |
| 1586 | 0.321 |
| 1587 | 0.32 |
| 1588 | 0.316 |
| 1589 | 0.32 |
| 1590 | 0.326 |
| 1591 | 0.329 |
| 1592 | 0.329 |
| 1593 | 0.328 |
| 1594 | 0.325 |
| 1595 | 0.325 |
| 1596 | 0.326 |
| 1597 | 0.326 |
| 1598 | 0.323 |
| 1599 | 0.321 |
| 1600 | 0.322 |
| 1601 | 0.322 |
| 1602 | 0.323 |
| 1603 | 0.321 |
| 1604 | 0.318 |
| 1605 | 0.318 |
| 1606 | 0.328 |
| 1607 | 0.331 |
| 1608 | 0.33 |
| 1609 | 0.326 |
| 1610 | 0.323 |
| 1611 | 0.325 |
| 1612 | 0.327 |
| 1613 | 0.325 |
| 1614 | 0.324 |
| 1615 | 0.319 |
| 1616 | 0.322 |
| 1617 | 0.316 |
| 1618 | 0.317 |
| 1619 | 0.321 |
| 1620 | 0.319 |
| 1621 | 0.317 |
| 1622 | 0.317 |
| 1623 | 0.316 |
| 1624 | 0.315 |
| 1625 | 0.318 |
| 1626 | 0.319 |
| 1627 | 0.318 |
| 1628 | 0.323 |
| 1629 | 0.323 |
| 1630 | 0.322 |
| 1631 | 0.324 |
| 1632 | 0.328 |
| 1633 | 0.327 |
| 1634 | 0.329 |
| 1635 | 0.33 |
| 1636 | 0.336 |
| 1637 | 0.337 |
| 1638 | 0.336 |
| 1639 | 0.339 |
| 1640 | 0.332 |
| 1641 | 0.33 |
| 1642 | 0.331 |
| 1643 | 0.327 |
| 1644 | 0.325 |
| 1645 | 0.326 |
| 1646 | 0.324 |
| 1647 | 0.327 |
| 1648 | 0.327 |
| 1649 | 0.328 |
| 1650 | 0.328 |
| 1651 | 0.326 |
| 1652 | 0.324 |
| 1653 | 0.325 |
| 1654 | 0.323 |
| 1655 | 0.323 |
| 1656 | 0.325 |
| 1657 | 0.324 |
| 1658 | 0.325 |
| 1659 | 0.325 |
| 1660 | 0.326 |
| 1661 | 0.329 |
| 1662 | 0.327 |
| 1663 | 0.328 |
| 1664 | 0.325 |
| 1665 | 0.323 |
| 1666 | 0.322 |
| 1667 | 0.319 |
| 1668 | 0.312 |
| 1669 | 0.311 |
| 1670 | 0.314 |
| 1671 | 0.319 |
| 1672 | 0.314 |
| 1673 | 0.316 |
| 1674 | 0.317 |
| 1675 | 0.32 |
| 1676 | 0.32 |
| 1677 | 0.313 |
| 1678 | 0.314 |
| 1679 | 0.316 |
| 1680 | 0.319 |
| 1681 | 0.313 |
| 1682 | 0.307 |
| 1683 | 0.304 |
| 1684 | 0.307 |
| 1685 | 0.307 |
| 1686 | 0.307 |
| 1687 | 0.307 |
| 1688 | 0.314 |
| 1689 | 0.314 |
| 1690 | 0.314 |
| 1691 | 0.314 |
| 1692 | 0.32 |
| 1693 | 0.319 |
| 1694 | 0.318 |
| 1695 | 0.322 |
| 1696 | 0.322 |
| 1697 | 0.32 |
| 1698 | 0.321 |
| 1699 | 0.317 |
| 1700 | 0.318 |
| 1701 | 0.314 |
| 1702 | 0.319 |
| 1703 | 0.318 |
| 1704 | 0.313 |
| 1705 | 0.312 |
| 1706 | 0.312 |
| 1707 | 0.314 |
| 1708 | 0.316 |
| 1709 | 0.315 |
| 1710 | 0.322 |
| 1711 | 0.323 |
| 1712 | 0.321 |
| 1713 | 0.312 |
| 1714 | 0.313 |
| 1715 | 0.313 |
| 1716 | 0.314 |
| 1717 | 0.316 |
| 1718 | 0.314 |
| 1719 | 0.318 |
| 1720 | 0.315 |
| 1721 | 0.312 |
| 1722 | 0.311 |
| 1723 | 0.31 |
| 1724 | 0.312 |
| 1725 | 0.313 |
| 1726 | 0.313 |
| 1727 | 0.318 |
| 1728 | 0.321 |
| 1729 | 0.32 |
| 1730 | 0.319 |
| 1731 | 0.317 |
| 1732 | 0.311 |
| 1733 | 0.309 |
| 1734 | 0.309 |
| 1735 | 0.304 |
| 1736 | 0.304 |
| 1737 | 0.304 |
| 1738 | 0.306 |
| 1739 | 0.307 |
| 1740 | 0.31 |
| 1741 | 0.315 |
| 1742 | 0.314 |
| 1743 | 0.321 |
| 1744 | 0.327 |
| 1745 | 0.331 |
| 1746 | 0.332 |
| 1747 | 0.334 |
| 1748 | 0.332 |
| 1749 | 0.334 |
| 1750 | 0.342 |
| 1751 | 0.339 |
| 1752 | 0.341 |
| 1753 | 0.345 |
| 1754 | 0.347 |
| 1755 | 0.345 |
| 1756 | 0.345 |
| 1757 | 0.343 |
| 1758 | 0.344 |
| 1759 | 0.345 |
| 1760 | 0.346 |
| 1761 | 0.343 |
| 1762 | 0.341 |
| 1763 | 0.342 |
| 1764 | 0.341 |
| 1765 | 0.337 |
| 1766 | 0.333 |
| 1767 | 0.328 |
| 1768 | 0.33 |
| 1769 | 0.328 |
| 1770 | 0.329 |
| 1771 | 0.331 |
| 1772 | 0.329 |
| 1773 | 0.33 |
| 1774 | 0.329 |
| 1775 | 0.326 |
| 1776 | 0.326 |
| 1777 | 0.325 |
| 1778 | 0.328 |
| 1779 | 0.323 |
| 1780 | 0.322 |
| 1781 | 0.321 |
| 1782 | 0.318 |
| 1783 | 0.318 |